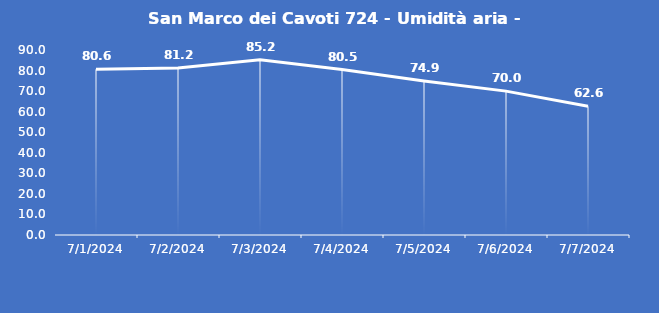
| Category | San Marco dei Cavoti 724 - Umidità aria - Grezzo (%) |
|---|---|
| 7/1/24 | 80.6 |
| 7/2/24 | 81.2 |
| 7/3/24 | 85.2 |
| 7/4/24 | 80.5 |
| 7/5/24 | 74.9 |
| 7/6/24 | 70 |
| 7/7/24 | 62.6 |